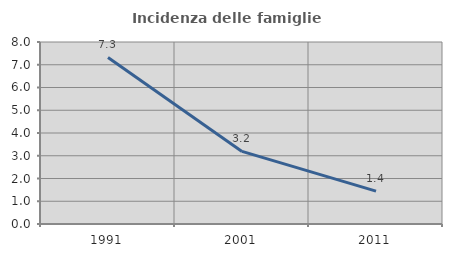
| Category | Incidenza delle famiglie numerose |
|---|---|
| 1991.0 | 7.321 |
| 2001.0 | 3.19 |
| 2011.0 | 1.444 |